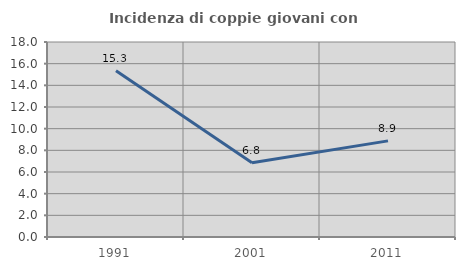
| Category | Incidenza di coppie giovani con figli |
|---|---|
| 1991.0 | 15.344 |
| 2001.0 | 6.849 |
| 2011.0 | 8.874 |